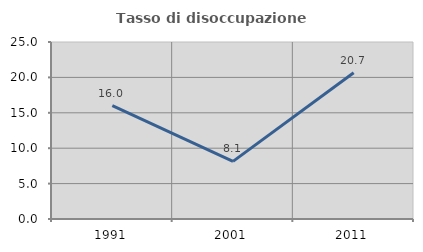
| Category | Tasso di disoccupazione giovanile  |
|---|---|
| 1991.0 | 16.003 |
| 2001.0 | 8.142 |
| 2011.0 | 20.667 |